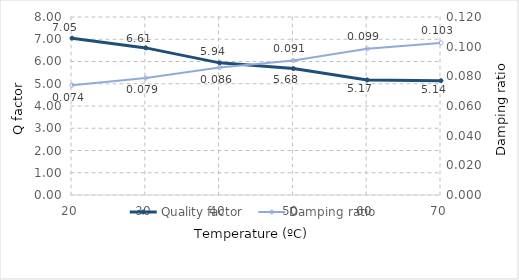
| Category | Quality factor |
|---|---|
| 20.0 | 7.049 |
| 30.0 | 6.611 |
| 40.0 | 5.939 |
| 50.0 | 5.681 |
| 60.0 | 5.171 |
| 70.0 | 5.137 |